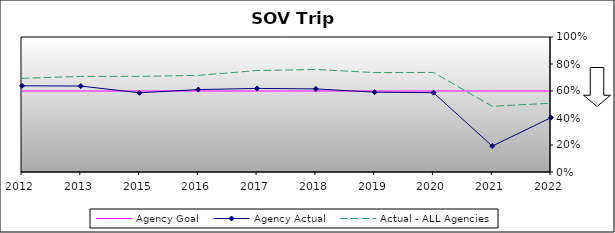
| Category | Agency Goal | Agency Actual | Actual - ALL Agencies |
|---|---|---|---|
| 2012.0 | 0.6 | 0.638 | 0.694 |
| 2013.0 | 0.6 | 0.637 | 0.708 |
| 2015.0 | 0.6 | 0.587 | 0.708 |
| 2016.0 | 0.6 | 0.611 | 0.716 |
| 2017.0 | 0.6 | 0.619 | 0.752 |
| 2018.0 | 0.6 | 0.616 | 0.759 |
| 2019.0 | 0.6 | 0.591 | 0.736 |
| 2020.0 | 0.6 | 0.588 | 0.737 |
| 2021.0 | 0.6 | 0.192 | 0.487 |
| 2022.0 | 0.6 | 0.403 | 0.509 |